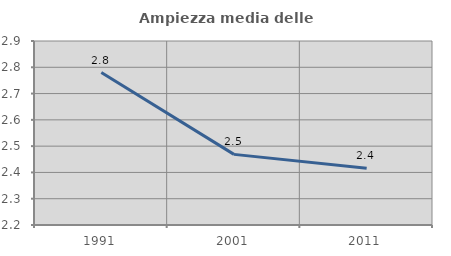
| Category | Ampiezza media delle famiglie |
|---|---|
| 1991.0 | 2.78 |
| 2001.0 | 2.469 |
| 2011.0 | 2.416 |